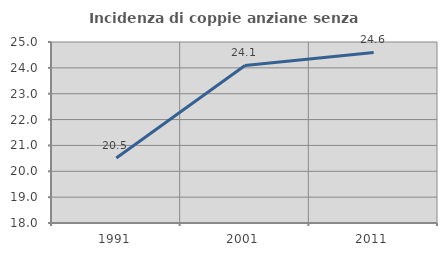
| Category | Incidenza di coppie anziane senza figli  |
|---|---|
| 1991.0 | 20.515 |
| 2001.0 | 24.094 |
| 2011.0 | 24.594 |